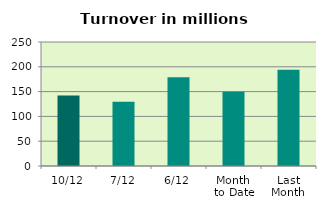
| Category | Series 0 |
|---|---|
| 10/12 | 142.14 |
| 7/12 | 129.763 |
| 6/12 | 178.825 |
| Month 
to Date | 149.844 |
| Last
Month | 193.997 |